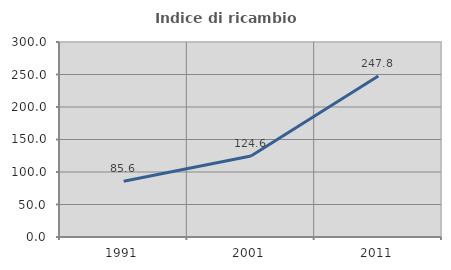
| Category | Indice di ricambio occupazionale  |
|---|---|
| 1991.0 | 85.629 |
| 2001.0 | 124.603 |
| 2011.0 | 247.826 |